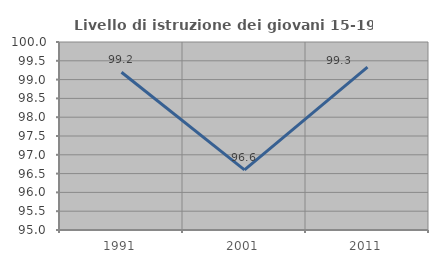
| Category | Livello di istruzione dei giovani 15-19 anni |
|---|---|
| 1991.0 | 99.197 |
| 2001.0 | 96.599 |
| 2011.0 | 99.333 |